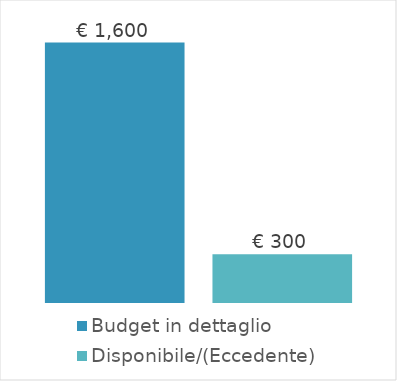
| Category | Budget in dettaglio | Disponibile/(Eccedente) |
|---|---|---|
| 0 | 1600 | 300 |